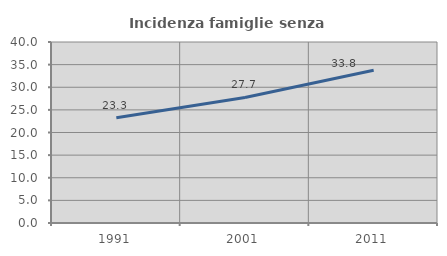
| Category | Incidenza famiglie senza nuclei |
|---|---|
| 1991.0 | 23.276 |
| 2001.0 | 27.741 |
| 2011.0 | 33.751 |